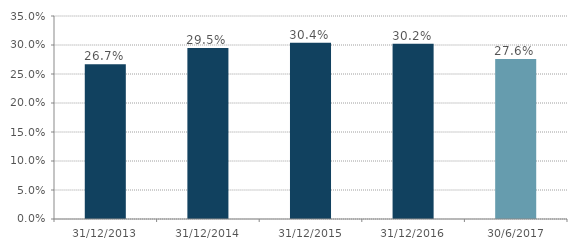
| Category | Series 0 |
|---|---|
| 2013-12-31 | 0.267 |
| 2014-12-31 | 0.295 |
| 2015-12-31 | 0.304 |
| 2016-12-31 | 0.302 |
| 2017-06-30 | 0.276 |